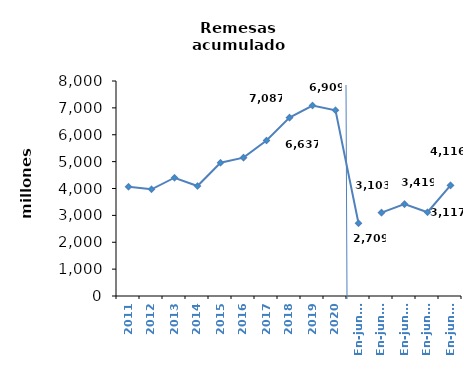
| Category | Series 0 |
|---|---|
| 2011 | 4064.096 |
| 2012 | 3969.659 |
| 2013 | 4401.044 |
| 2014 | 4093.207 |
| 2015 | 4957.39 |
| 2016 | 5147.47 |
| 2017 | 5783.73 |
| 2018 | 6636.5 |
| 2019 | 7086.53 |
| 2020 | 6908.85 |
| En-jun.17 | 2708.52 |
| En-jun.18 | 3102.7 |
| En-jun.19 | 3419.21 |
| En-jun.20 | 3117.45 |
| En-jun.21 | 4116.35 |